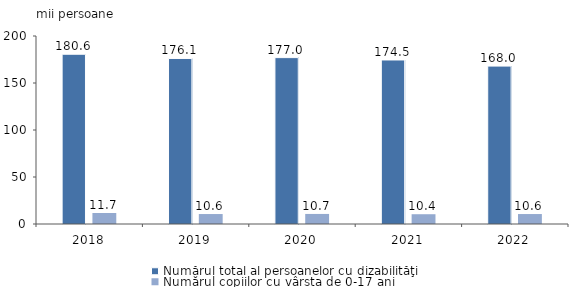
| Category | Numărul total al persoanelor cu dizabilităţi | Numărul copiilor cu vârsta de 0-17 ani |
|---|---|---|
| 2018.0 | 180.6 | 11.7 |
| 2019.0 | 176.1 | 10.6 |
| 2020.0 | 177 | 10.7 |
| 2021.0 | 174.5 | 10.4 |
| 2022.0 | 168 | 10.6 |